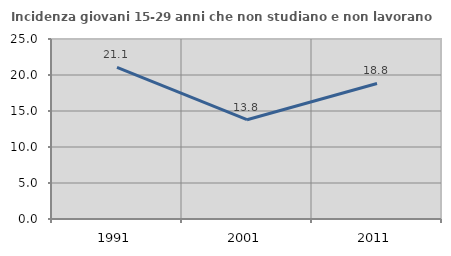
| Category | Incidenza giovani 15-29 anni che non studiano e non lavorano  |
|---|---|
| 1991.0 | 21.065 |
| 2001.0 | 13.793 |
| 2011.0 | 18.828 |